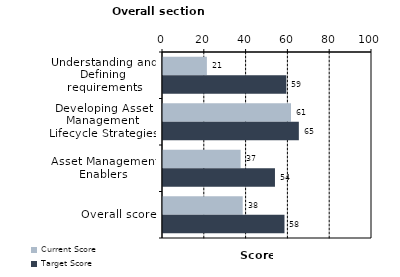
| Category | Current Score | Target Score |
|---|---|---|
| Understanding and Defining requirements | 21 | 59 |
| Developing Asset Management Lifecycle Strategies | 61.25 | 65 |
| Asset Management Enablers | 37.143 | 53.571 |
| Overall score | 38.125 | 58.125 |